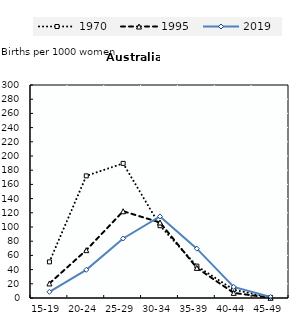
| Category | 1970 | 1995 | 2019 |
|---|---|---|---|
| 15-19 | 50.9 | 20.5 | 8.7 |
| 20-24 | 172 | 67.4 | 39.7 |
| 25-29 | 189.6 | 122.2 | 83.8 |
| 30-34 | 101.8 | 106.4 | 114.9 |
| 35-39 | 44.9 | 42.4 | 69.5 |
| 40-44 | 11.7 | 7.2 | 15.6 |
| 45-49 | 0.8 | 0.3 | 1.3 |